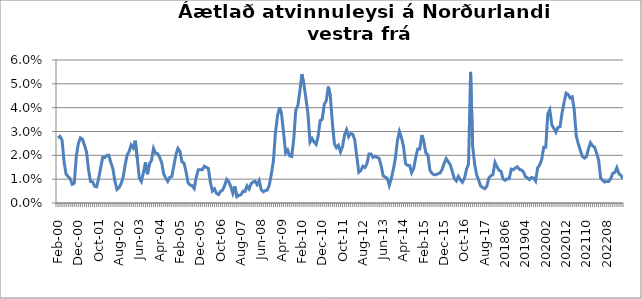
| Category | Series 0 |
|---|---|
| feb.00 | 0.027 |
| mar.00 | 0.028 |
| apr.00 | 0.026 |
| maí.00 | 0.017 |
| jún.00 | 0.012 |
| júl.00 | 0.011 |
| ágú.00 | 0.01 |
| sep.00 | 0.008 |
| okt.00 | 0.008 |
| nóv.00 | 0.02 |
| des.00 | 0.025 |
| jan.01 | 0.027 |
| feb.01 | 0.027 |
| mar.01 | 0.024 |
| apr.01 | 0.022 |
| maí.01 | 0.014 |
| jún.01 | 0.009 |
| júl.01 | 0.009 |
| ágú.01 | 0.007 |
| sep.01 | 0.007 |
| okt.01 | 0.01 |
| nóv.01 | 0.015 |
| des.01 | 0.019 |
| jan.02 | 0.019 |
| feb.02 | 0.02 |
| mar.02 | 0.02 |
| apr.02 | 0.017 |
| maí.02 | 0.014 |
| jún.02 | 0.009 |
| júl.02 | 0.006 |
| ágú.02 | 0.006 |
| sep.02 | 0.008 |
| okt.02 | 0.011 |
| nóv.02 | 0.016 |
| des.02 | 0.02 |
| jan.03 | 0.022 |
| feb.03 | 0.024 |
| mar.03 | 0.023 |
| apr.03 | 0.026 |
| maí.03 | 0.019 |
| jún.03 | 0.01 |
| júl.03 | 0.009 |
| ágú.03 | 0.013 |
| sep.03 | 0.017 |
| okt.03 | 0.012 |
| nóv.03 | 0.016 |
| des.03 | 0.018 |
| jan.04 | 0.023 |
| feb.04 | 0.021 |
| mar.04 | 0.021 |
| apr.04 | 0.019 |
| maí.04 | 0.017 |
| jún.04 | 0.012 |
| júl.04 | 0.011 |
| ágú.04 | 0.009 |
| sep.04 | 0.011 |
| okt.04 | 0.011 |
| nóv.04 | 0.016 |
| des.04 | 0.02 |
| jan.05 | 0.023 |
| feb.05 | 0.022 |
| mar.05 | 0.017 |
| apr.05 | 0.017 |
| maí.05 | 0.013 |
| jún.05 | 0.009 |
| júl.05 | 0.008 |
| ágú.05 | 0.007 |
| sep.05 | 0.006 |
| okt.05 | 0.011 |
| nóv.05 | 0.014 |
| des.05 | 0.014 |
| jan.06 | 0.014 |
| feb.06 | 0.015 |
| mar.06 | 0.015 |
| apr.06 | 0.014 |
| maí.06 | 0.009 |
| jún.06 | 0.005 |
| júl.06 | 0.006 |
| ágú.06 | 0.004 |
| sep.06 | 0.004 |
| okt.06 | 0.005 |
| nóv.06 | 0.005 |
| des.06 | 0.007 |
| jan.07 | 0.01 |
| feb.07 | 0.009 |
| mar.07 | 0.007 |
| apr.07 | 0.004 |
| maí.07 | 0.007 |
| jún.07 | 0.003 |
| júl.07 | 0.003 |
| ágú.07 | 0.003 |
| sep.07 | 0.005 |
| okt.07 | 0.005 |
| nóv.07 | 0.007 |
| des.07 | 0.006 |
| jan.08 | 0.008 |
| feb.08 | 0.009 |
| mar.08 | 0.009 |
| apr.08 | 0.008 |
| maí.08 | 0.009 |
| jún.08 | 0.006 |
| júl.08 | 0.005 |
| ágú.08 | 0.005 |
| sep.08 | 0.005 |
| okt.08 | 0.008 |
| nóv.08 | 0.012 |
| des.08 | 0.018 |
| jan.09 | 0.03 |
| feb.09 | 0.036 |
| mar.09 | 0.04 |
| apr.09 | 0.037 |
| maí.09 | 0.029 |
| jún.09 | 0.021 |
| júl.09 | 0.022 |
| ágú.09 | 0.02 |
| sep.09 | 0.02 |
| okt.09 | 0.027 |
| nóv.09 | 0.039 |
| des.09 | 0.041 |
| jan.10 | 0.047 |
| feb.10 | 0.054 |
| mar.10 | 0.05 |
| apr.10 | 0.044 |
| maí.10 | 0.037 |
| jún.10 | 0.026 |
| júl.10 | 0.027 |
| ágú.10 | 0.026 |
| sep.10 | 0.025 |
| okt.10 | 0.028 |
| nóv.10 | 0.035 |
| des.10 | 0.035 |
| jan.11 | 0.041 |
| feb.11 | 0.043 |
| mar.11 | 0.049 |
| apr.11 | 0.045 |
| maí.11 | 0.034 |
| jún.11 | 0.025 |
| júl.11 | 0.023 |
| ágú.11 | 0.024 |
| sep.11 | 0.021 |
| okt.11 | 0.024 |
| nóv.11 | 0.029 |
| des.11 | 0.031 |
| jan.12 | 0.028 |
| feb.12 | 0.029 |
| mar.12 | 0.029 |
| apr.12 | 0.027 |
| maí.12 | 0.02 |
| jún.12 | 0.013 |
| júl.12 | 0.014 |
| ágú.12 | 0.015 |
| sep.12 | 0.015 |
| okt.12 | 0.016 |
| nóv.12 | 0.021 |
| des.12 | 0.021 |
| jan.13 | 0.019 |
| feb.13 | 0.02 |
| mar.13 | 0.019 |
| apr.13 | 0.019 |
| maí.13 | 0.016 |
| jún.13 | 0.011 |
| júl.13 | 0.011 |
| ágú.13 | 0.01 |
| sep.13 | 0.007 |
| okt.13 | 0.01 |
| nóv.13 | 0.014 |
| des.13 | 0.019 |
| jan.14* | 0.026 |
| feb.14 | 0.03 |
| mar.14 | 0.027 |
| apr.14 | 0.024 |
| maí.14 | 0.017 |
| jún.14 | 0.016 |
| júl.14 | 0.016 |
| ágú.14 | 0.013 |
| sep.14 | 0.014 |
| okt.14 | 0.019 |
| nóv.14 | 0.023 |
| des.14 | 0.023 |
| jan.15 | 0.029 |
| feb.15 | 0.026 |
| mar.15 | 0.021 |
| apr.15 | 0.02 |
| maí.15 | 0.014 |
| jún.15 | 0.012 |
| júl.15 | 0.012 |
| ágú.15 | 0.012 |
| sep.15 | 0.012 |
| okt.15 | 0.013 |
| nóv.15 | 0.014 |
| des.15 | 0.017 |
| jan.16 | 0.019 |
| feb.16 | 0.017 |
| mar.16 | 0.016 |
| apr.16 | 0.013 |
| maí.16 | 0.01 |
| jún.16 | 0.009 |
| júl.16 | 0.011 |
| ágú.16 | 0.01 |
| sep.16 | 0.009 |
| okt.16 | 0.01 |
| nóv.16 | 0.014 |
| des.16 | 0.016 |
| jan.17 | 0.055 |
| feb.17 | 0.024 |
| mar.17 | 0.016 |
| apr.17 | 0.012 |
| maí.17 | 0.01 |
| jún.17 | 0.007 |
| júl.17 | 0.007 |
| ágú.17 | 0.006 |
| sep.17 | 0.007 |
| 201710 | 0.01 |
| 201711 | 0.011 |
| 201712 | 0.012 |
| 201801 | 0.017 |
| 201802 | 0.015 |
| 201803 | 0.014 |
| 201804 | 0.013 |
| 201805 | 0.01 |
| 201806 | 0.01 |
| 201807 | 0.01 |
| 201808 | 0.01 |
| 201809 | 0.014 |
| 201810 | 0.014 |
| 201811 | 0.015 |
| 201812 | 0.015 |
| 201901 | 0.014 |
| 201902 | 0.014 |
| 201903 | 0.013 |
| 201904 | 0.011 |
| 201905 | 0.011 |
| 201906 | 0.01 |
| 201907 | 0.011 |
| 201908 | 0.01 |
| 201909 | 0.009 |
| 201910 | 0.015 |
| 201911 | 0.016 |
| 201912 | 0.018 |
| 202001 | 0.023 |
| 202002 | 0.023 |
| 202003 | 0.037 |
| 202004 | 0.039 |
| 202005 | 0.033 |
| 202006 | 0.031 |
| 202007 | 0.03 |
| 202008 | 0.032 |
| 202009 | 0.032 |
| 202010 | 0.038 |
| 202011 | 0.042 |
| 202012 | 0.046 |
| 202101 | 0.046 |
| 202102 | 0.044 |
| 202103 | 0.045 |
| 202104 | 0.039 |
| 202105 | 0.028 |
| 202106 | 0.025 |
| 202107 | 0.022 |
| 202108 | 0.02 |
| 202109 | 0.019 |
| 202110 | 0.019 |
| 202111 | 0.023 |
| 202112 | 0.025 |
| 202201 | 0.024 |
| 202202 | 0.023 |
| 202203 | 0.021 |
| 202204 | 0.018 |
| 202205 | 0.011 |
| 202206 | 0.01 |
| 202207 | 0.009 |
| 202208 | 0.009 |
| 202209 | 0.009 |
| 202210 | 0.01 |
| 202211 | 0.013 |
| 202212 | 0.013 |
| 202301 | 0.015 |
| 202302 | 0.012 |
| 202303 | 0.012 |
| 202304 | 0.01 |